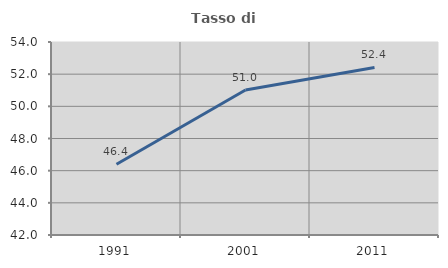
| Category | Tasso di occupazione   |
|---|---|
| 1991.0 | 46.403 |
| 2001.0 | 51.014 |
| 2011.0 | 52.416 |